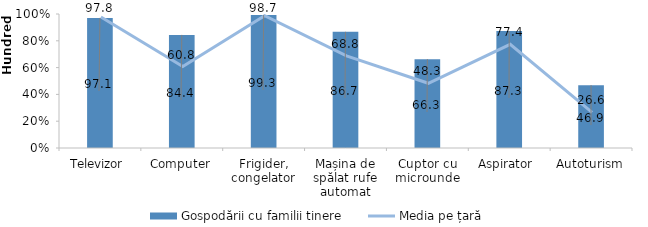
| Category | Gospodării cu familii tinere |
|---|---|
| Televizor | 97.1 |
| Computer | 84.4 |
| Frigider, congelator | 99.3 |
| Mașina de spălat rufe automat | 86.7 |
| Cuptor cu microunde | 66.3 |
| Aspirator  | 87.3 |
| Autoturism | 46.9 |